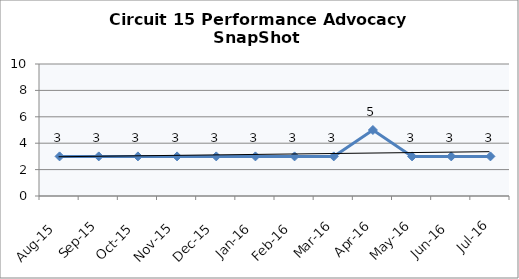
| Category | Circuit 15 |
|---|---|
| Aug-15 | 3 |
| Sep-15 | 3 |
| Oct-15 | 3 |
| Nov-15 | 3 |
| Dec-15 | 3 |
| Jan-16 | 3 |
| Feb-16 | 3 |
| Mar-16 | 3 |
| Apr-16 | 5 |
| May-16 | 3 |
| Jun-16 | 3 |
| Jul-16 | 3 |